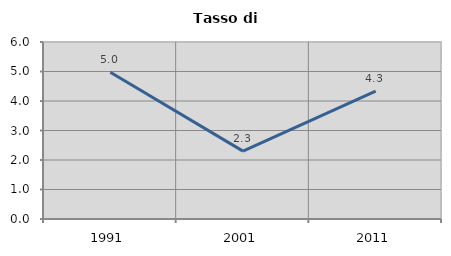
| Category | Tasso di disoccupazione   |
|---|---|
| 1991.0 | 4.973 |
| 2001.0 | 2.301 |
| 2011.0 | 4.337 |